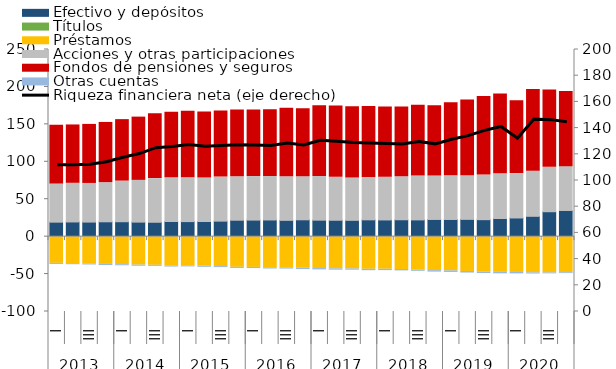
| Category | Efectivo y depósitos | Títulos | Préstamos  | Acciones y otras participaciones  | Fondos de pensiones y seguros | Otras cuentas |
|---|---|---|---|---|---|---|
| 0 | 19.19 | 0.164 | -35.713 | 50.878 | 78.573 | -1.406 |
| 1 | 19.47 | 0.158 | -36.111 | 51.624 | 77.957 | -1.412 |
| 2 | 19.299 | 0.153 | -36.467 | 51.61 | 78.865 | -1.36 |
| 3 | 19.697 | 0.144 | -37.105 | 52.319 | 80.41 | -1.508 |
| 4 | 19.775 | 0.147 | -37.466 | 54.28 | 82.114 | -1.47 |
| 5 | 19.259 | 0.144 | -38.045 | 55.765 | 84.495 | -1.448 |
| 6 | 19.046 | 0.157 | -38.303 | 58.306 | 86.812 | -1.36 |
| 7 | 20.063 | 0.159 | -39.141 | 58.555 | 87.38 | -1.467 |
| 8 | 19.942 | 0.158 | -39.026 | 58.548 | 88.831 | -1.39 |
| 9 | 20.033 | 0.157 | -39.461 | 58.042 | 88.406 | -1.496 |
| 10 | 20.536 | 0.17 | -40.003 | 58.839 | 88.138 | -1.334 |
| 11 | 21.764 | 0.177 | -40.975 | 57.989 | 89.404 | -1.514 |
| 12 | 21.941 | 0.155 | -41.085 | 58.208 | 88.989 | -1.543 |
| 13 | 22.104 | 0.152 | -41.576 | 58.155 | 89.102 | -1.64 |
| 14 | 21.614 | 0.157 | -41.72 | 58.228 | 91.63 | -1.606 |
| 15 | 22.343 | 0.159 | -42.184 | 57.573 | 90.64 | -1.776 |
| 16 | 21.849 | 0.157 | -42.621 | 58.317 | 94.438 | -1.8 |
| 17 | 21.72 | 0.157 | -42.998 | 57.364 | 95.143 | -1.794 |
| 18 | 21.631 | 0.146 | -43.117 | 56.612 | 95.024 | -1.709 |
| 19 | 22.317 | 0.142 | -43.62 | 56.682 | 94.62 | -1.86 |
| 20 | 22.153 | 0.153 | -43.579 | 57.165 | 93.802 | -1.818 |
| 21 | 22.394 | 0.159 | -43.915 | 57.482 | 93.276 | -1.859 |
| 22 | 22.222 | 0.156 | -44.501 | 58.545 | 94.731 | -1.822 |
| 23 | 22.813 | 0.159 | -45.406 | 58.193 | 93.785 | -1.955 |
| 24 | 22.767 | 0.182 | -45.703 | 58.35 | 97.648 | -2.111 |
| 25 | 22.911 | 0.178 | -46.511 | 58.421 | 100.964 | -2.118 |
| 26 | 22.476 | 0.202 | -47.174 | 59.508 | 104.955 | -2.118 |
| 27 | 24.008 | 0.245 | -47.724 | 59.837 | 106.479 | -1.969 |
| 28 | 24.679 | 0.269 | -47.842 | 59.275 | 97.434 | -1.916 |
| 29 | 26.895 | 0.271 | -48.366 | 60.311 | 108.959 | -1.559 |
| 30 | 32.965 | 0.324 | -48.445 | 59.444 | 103.048 | -1.25 |
| 31 | 34.668 | 0.305 | -48.193 | 58.556 | 100.313 | -1.184 |